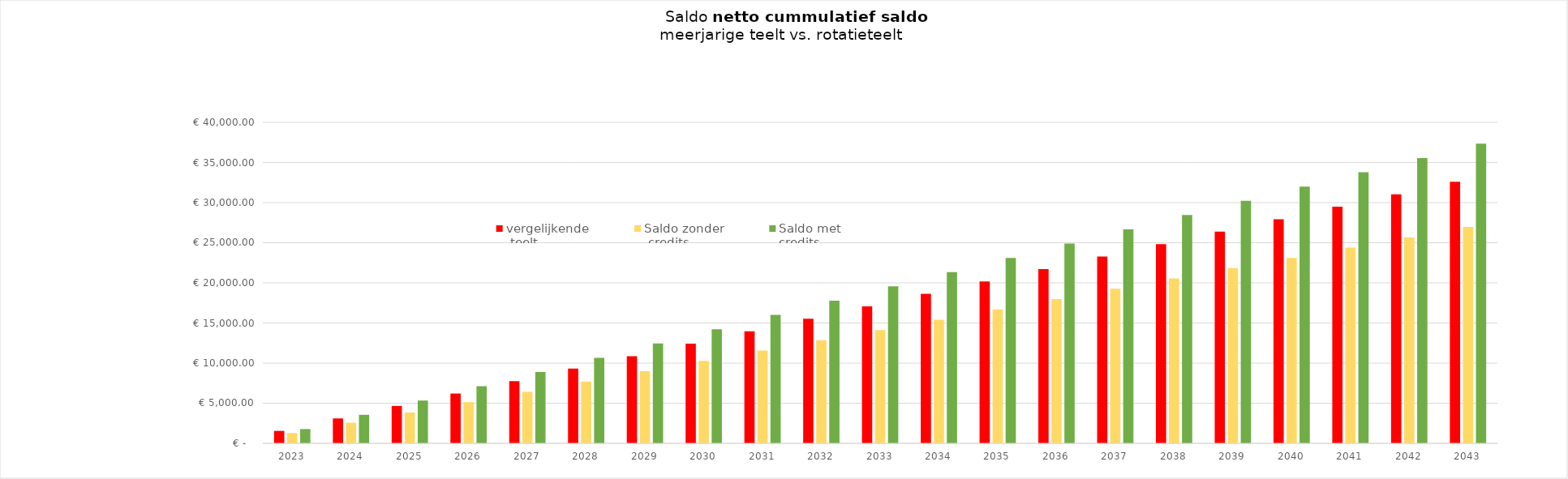
| Category | vergelijkende
 teelt | Saldo zonder
 credits | Saldo met 
credits  |
|---|---|---|---|
| 2023.0 | 1552 | 1284.25 | 1778.17 |
| 2024.0 | 3104 | 2568.5 | 3556.34 |
| 2025.0 | 4656 | 3852.75 | 5334.51 |
| 2026.0 | 6208 | 5137 | 7112.68 |
| 2027.0 | 7760 | 6421.25 | 8890.85 |
| 2028.0 | 9312 | 7705.5 | 10669.02 |
| 2029.0 | 10864 | 8989.75 | 12447.19 |
| 2030.0 | 12416 | 10274 | 14225.36 |
| 2031.0 | 13968 | 11558.25 | 16003.53 |
| 2032.0 | 15520 | 12842.5 | 17781.7 |
| 2033.0 | 17072 | 14126.75 | 19559.87 |
| 2034.0 | 18624 | 15411 | 21338.04 |
| 2035.0 | 20176 | 16695.25 | 23116.21 |
| 2036.0 | 21728 | 17979.5 | 24894.38 |
| 2037.0 | 23280 | 19263.75 | 26672.55 |
| 2038.0 | 24832 | 20548 | 28450.72 |
| 2039.0 | 26384 | 21832.25 | 30228.89 |
| 2040.0 | 27936 | 23116.5 | 32007.06 |
| 2041.0 | 29488 | 24400.75 | 33785.23 |
| 2042.0 | 31040 | 25685 | 35563.4 |
| 2043.0 | 32592 | 26969.25 | 37341.57 |